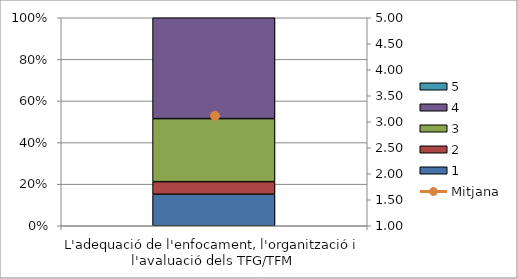
| Category | 1 | 2 | 3 | 4 | 5 |
|---|---|---|---|---|---|
| L'adequació de l'enfocament, l'organització i l'avaluació dels TFG/TFM | 5 | 2 | 10 | 16 | 0 |